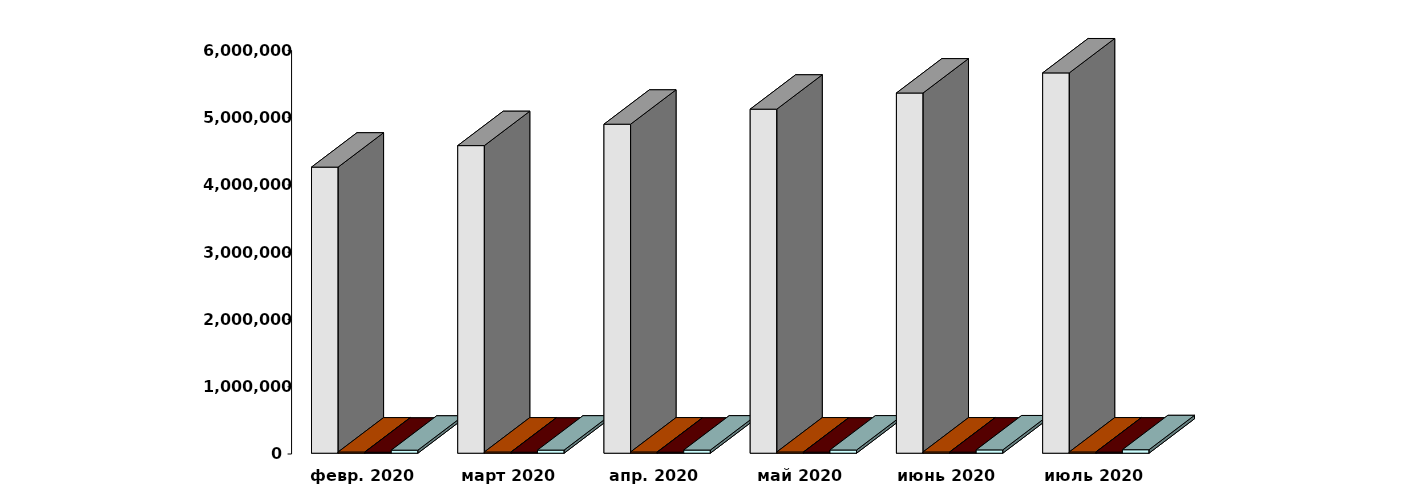
| Category | Физические лица | Юридические лица | Иностранные лица | Клиенты, передавшие свои средства в ДУ |
|---|---|---|---|---|
| 2020-02-29 | 4253153 | 17783 | 14404 | 45201 |
| 2020-03-30 | 4572906 | 17928 | 14988 | 46297 |
| 2020-04-30 | 4891213 | 18138 | 15242 | 46759 |
| 2020-05-30 | 5114736 | 18257 | 15483 | 47445 |
| 2020-06-30 | 5354906 | 18261 | 15817 | 49363 |
| 2020-07-31 | 5653690 | 18250 | 16100 | 51872 |